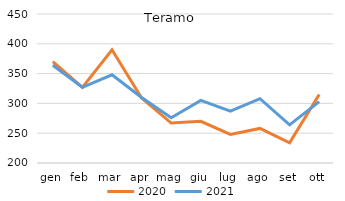
| Category | 2020 | 2021 |
|---|---|---|
| gen | 370 | 364 |
| feb | 327 | 327 |
| mar | 390 | 348 |
| apr | 309 | 310 |
| mag | 267 | 276 |
| giu | 270 | 305 |
| lug | 248 | 287 |
| ago | 258 | 308 |
| set | 234 | 264 |
| ott | 315 | 303 |